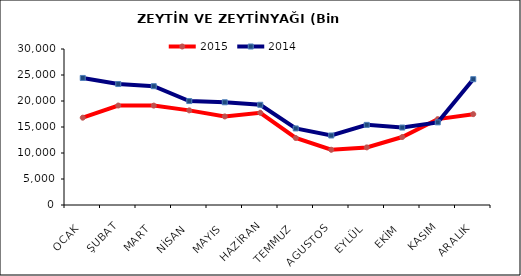
| Category | 2015 | 2014 |
|---|---|---|
| OCAK | 16791.807 | 24433.782 |
| ŞUBAT | 19131.206 | 23262.338 |
| MART | 19111.99 | 22845.745 |
| NİSAN | 18199.157 | 19989.73 |
| MAYIS | 17030.153 | 19755.836 |
| HAZİRAN | 17736.84 | 19273.121 |
| TEMMUZ | 12890.333 | 14721.921 |
| AGUSTOS | 10622.041 | 13367.266 |
| EYLÜL | 11077.792 | 15407.809 |
| EKİM | 13072.327 | 14895.794 |
| KASIM | 16511.367 | 15889.762 |
| ARALIK | 17469.195 | 24194.322 |